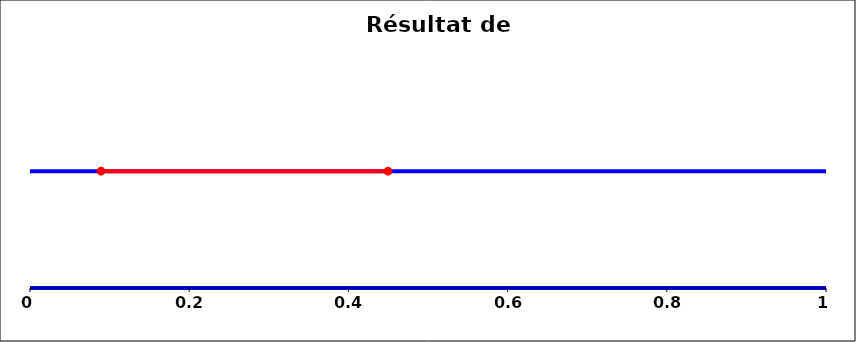
| Category | Series 0 |
|---|---|
| 0.4497381034469221 | 1 |
| 0.08924095222204809 | 1 |